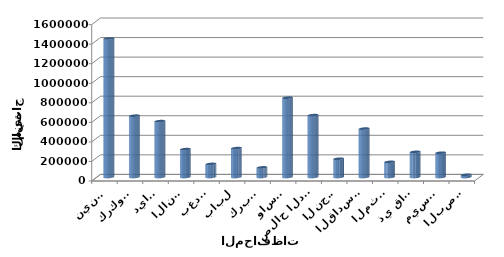
| Category |    الانتاج    (طن) |
|---|---|
| نينوى | 1417208 |
| كركوك | 627324 |
| ديالى | 571748 |
| الانبار | 285088 |
| بغداد | 133831 |
| بابل | 295465 |
| كربلاء | 98040 |
| واسط | 811384 |
| صلاح الدين | 633101 |
| النجف | 186730 |
| القادسية | 495224 |
| المثنى | 154975 |
| ذي قار  | 257243 |
| ميسان | 248296 |
| البصرة | 22735 |